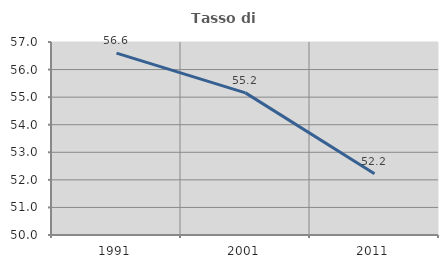
| Category | Tasso di occupazione   |
|---|---|
| 1991.0 | 56.597 |
| 2001.0 | 55.155 |
| 2011.0 | 52.221 |